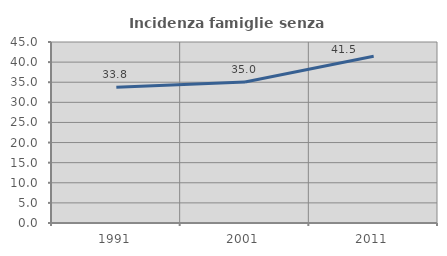
| Category | Incidenza famiglie senza nuclei |
|---|---|
| 1991.0 | 33.779 |
| 2001.0 | 35.032 |
| 2011.0 | 41.463 |